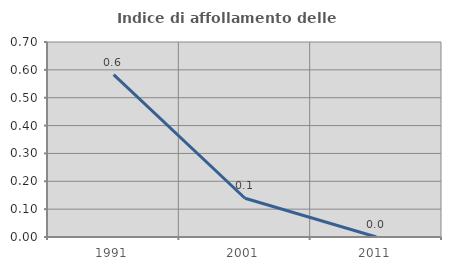
| Category | Indice di affollamento delle abitazioni  |
|---|---|
| 1991.0 | 0.583 |
| 2001.0 | 0.139 |
| 2011.0 | 0 |